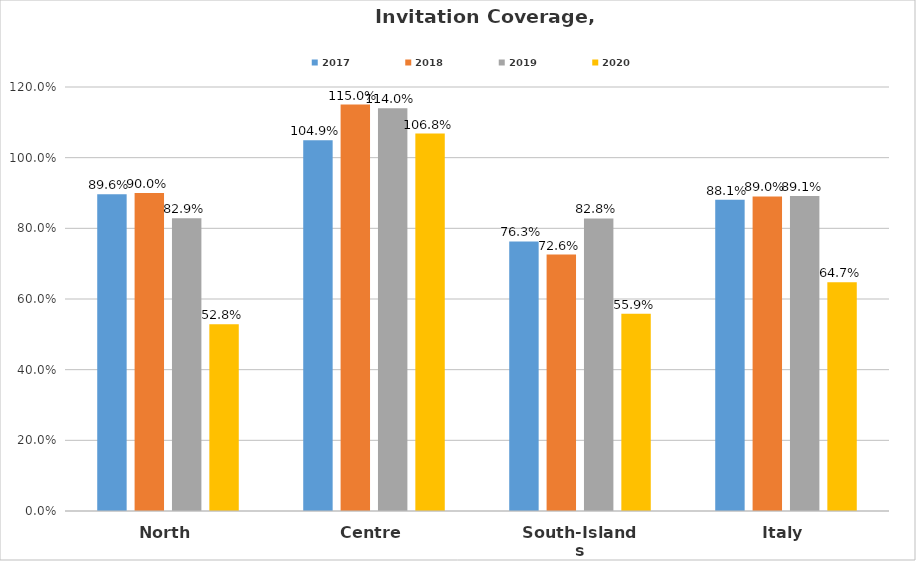
| Category | 2017 | 2018 | 2019 | 2020 |
|---|---|---|---|---|
| North | 0.896 | 0.9 | 0.829 | 0.528 |
| Centre | 1.049 | 1.15 | 1.14 | 1.068 |
| South-Islands | 0.763 | 0.726 | 0.828 | 0.559 |
| Italy | 0.881 | 0.89 | 0.891 | 0.647 |